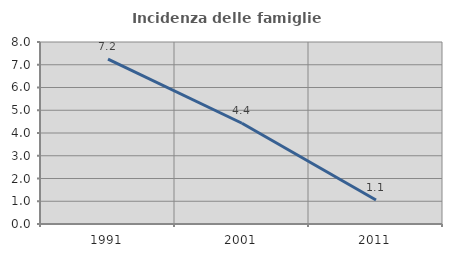
| Category | Incidenza delle famiglie numerose |
|---|---|
| 1991.0 | 7.246 |
| 2001.0 | 4.429 |
| 2011.0 | 1.053 |